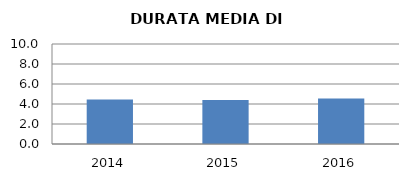
| Category | 2014 2015 2016 |
|---|---|
| 2014.0 | 4.439 |
| 2015.0 | 4.404 |
| 2016.0 | 4.538 |